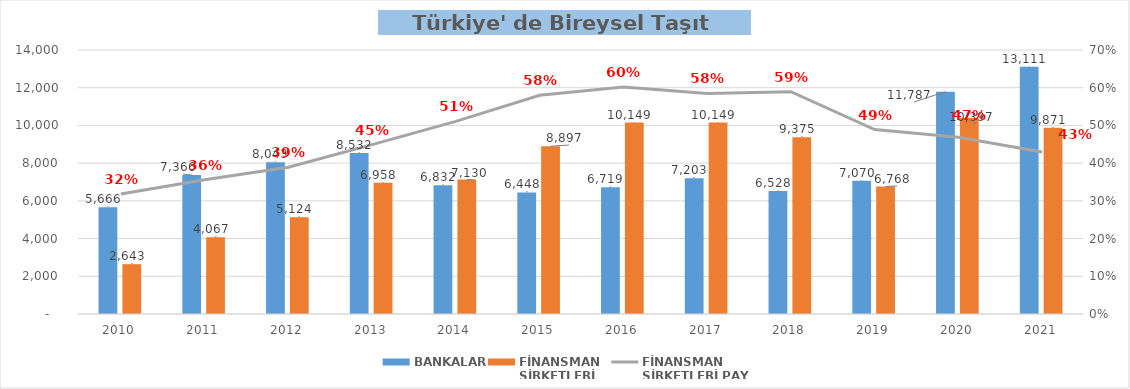
| Category | BANKALAR | FİNANSMAN 
ŞİRKETLERİ |
|---|---|---|
| 2010 | 5665.615 | 2643.169 |
| 2011 | 7366.42 | 4066.867 |
| 2012 | 8042.797 | 5124.261 |
| 2013 | 8531.566 | 6958.23 |
| 2014 | 6832.186 | 7129.957 |
| 2015 | 6447.808 | 8897.137 |
| 2016 | 6719.498 | 10148.982 |
| 2017 | 7202.608 | 10148.903 |
| 2018 | 6528.18 | 9375.099 |
| 2019 | 7070.3 | 6767.535 |
| 2020 | 11786.807 | 10397.228 |
| 2021 | 13111.088 | 9870.756 |